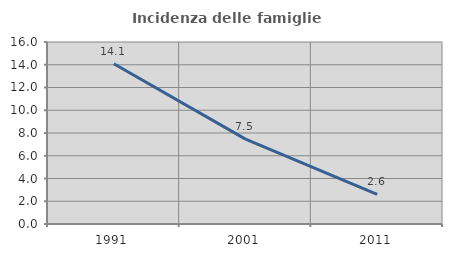
| Category | Incidenza delle famiglie numerose |
|---|---|
| 1991.0 | 14.085 |
| 2001.0 | 7.463 |
| 2011.0 | 2.614 |